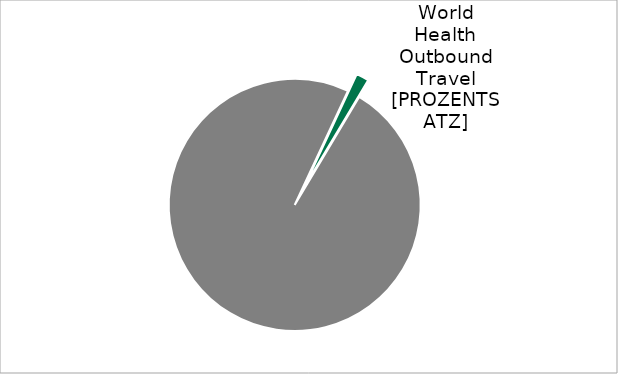
| Category | Series 0 |
|---|---|
| World Health Travel | 0.016 |
| Others | 0.987 |